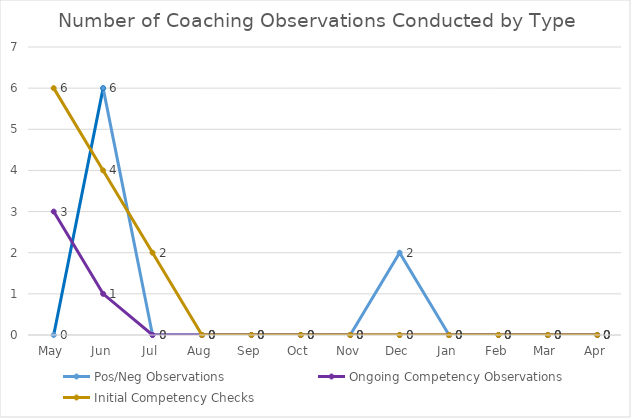
| Category | Pos/Neg Observations | Ongoing Competency Observations | Initial Competency Checks |
|---|---|---|---|
| May | 0 | 3 | 6 |
| Jun | 6 | 1 | 4 |
| Jul | 0 | 0 | 2 |
| Aug | 0 | 0 | 0 |
| Sep | 0 | 0 | 0 |
| Oct | 0 | 0 | 0 |
| Nov | 0 | 0 | 0 |
| Dec | 2 | 0 | 0 |
| Jan | 0 | 0 | 0 |
| Feb | 0 | 0 | 0 |
| Mar | 0 | 0 | 0 |
| Apr | 0 | 0 | 0 |